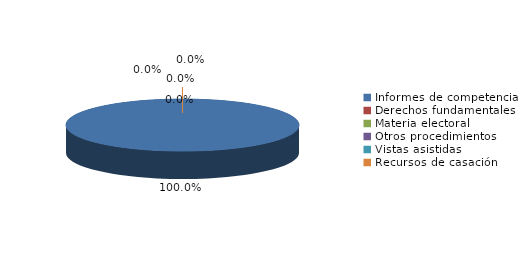
| Category | Series 0 |
|---|---|
| Informes de competencia | 56 |
| Derechos fundamentales | 0 |
| Materia electoral | 0 |
| Otros procedimientos | 0 |
| Vistas asistidas | 0 |
| Recursos de casación | 0 |